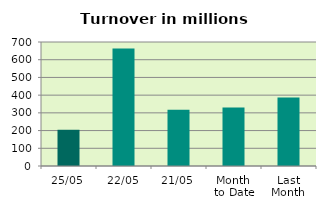
| Category | Series 0 |
|---|---|
| 25/05 | 204.551 |
| 22/05 | 663.268 |
| 21/05 | 317.905 |
| Month 
to Date | 329.944 |
| Last
Month | 387.046 |